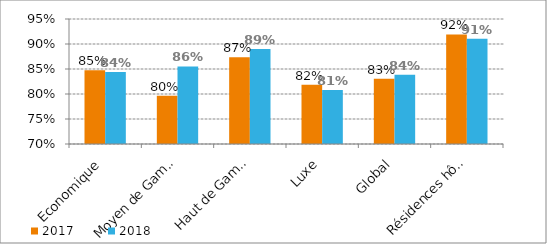
| Category | 2017 | 2018 |
|---|---|---|
| Economique | 0.848 | 0.844 |
| Moyen de Gamme | 0.797 | 0.855 |
| Haut de Gamme | 0.873 | 0.89 |
| Luxe | 0.818 | 0.808 |
| Global | 0.831 | 0.839 |
| Résidences hôtelières | 0.919 | 0.911 |